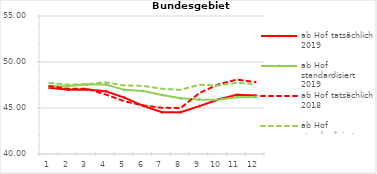
| Category | ab Hof tatsächlich 2019 | ab Hof standardisiert 2019 | ab Hof tatsächlich 2018 | ab Hof standardisiert 2018 |
|---|---|---|---|---|
| 0 | 47.201 | 47.359 | 47.377 | 47.726 |
| 1 | 46.995 | 47.38 | 47.085 | 47.535 |
| 2 | 47.014 | 47.549 | 47.102 | 47.588 |
| 3 | 46.826 | 47.56 | 46.465 | 47.794 |
| 4 | 46.13 | 46.971 | 45.733 | 47.452 |
| 5 | 45.225 | 46.844 | 45.281 | 47.403 |
| 6 | 44.547 | 46.422 | 45.02 | 47.094 |
| 7 | 44.536 | 46.05 | 45 | 46.977 |
| 8 | 45.208 | 45.919 | 46.625 | 47.527 |
| 9 | 45.93 | 45.894 | 47.562 | 47.452 |
| 10 | 46.44 | 46.173 | 48.089 | 47.744 |
| 11 | 46.369 | 46.188 | 47.809 | 47.587 |